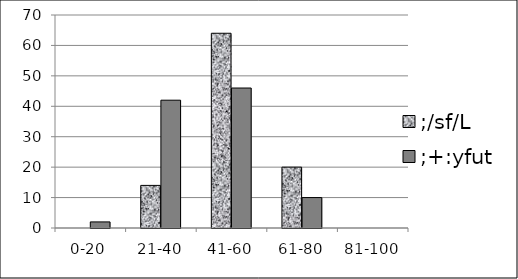
| Category | ;/sf/L | ;+:yfut |
|---|---|---|
| 0-20 | 0 | 2 |
| 21-40 | 14 | 42 |
| 41-60 | 64 | 46 |
| 61-80 | 20 | 10 |
| 81-100 | 0 | 0 |